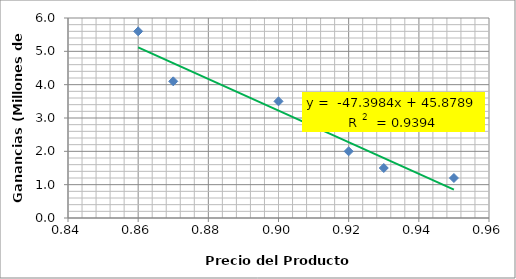
| Category | Precio del Producto ($) |
|---|---|
| 0.95 | 1.2 |
| 0.93 | 1.5 |
| 0.92 | 2 |
| 0.9 | 3.5 |
| 0.87 | 4.1 |
| 0.86 | 5.6 |